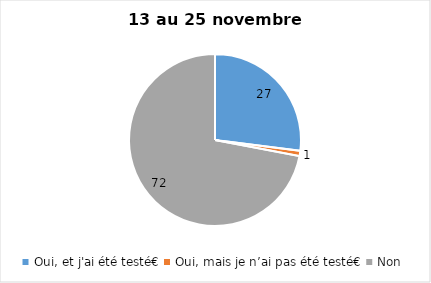
| Category | Series 0 |
|---|---|
| Oui, et j'ai été testé€ | 27 |
| Oui, mais je n’ai pas été testé€ | 1 |
| Non | 72 |